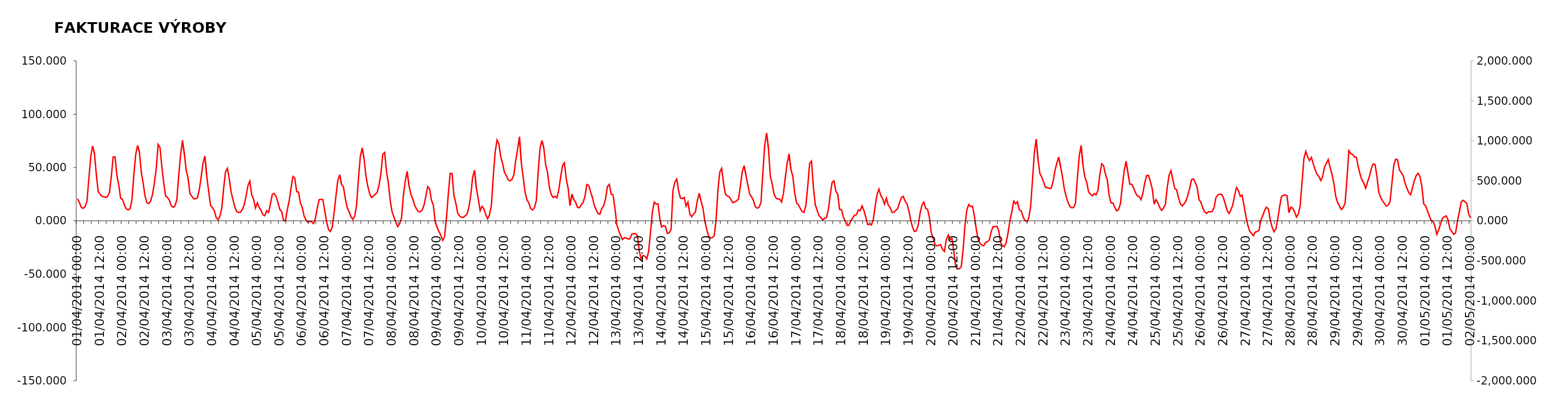
| Category | měření [MWh] |
|---|---|
| 01/04/2014 | 0 |
| 01/04/2014 | 0 |
| 01/04/2014 | 0 |
| 01/04/2014 | 0 |
| 01/04/2014 | 0 |
| 01/04/2014 | 0 |
| 01/04/2014 | 0 |
| 01/04/2014 | 0 |
| 01/04/2014 | 0 |
| 01/04/2014 | 0 |
| 01/04/2014 | 0 |
| 01/04/2014 | 0 |
| 01/04/2014 | 0 |
| 01/04/2014 | 0 |
| 01/04/2014 | 0 |
| 01/04/2014 | 0 |
| 01/04/2014 | 0 |
| 01/04/2014 | 0 |
| 01/04/2014 | 0 |
| 01/04/2014 | 0 |
| 01/04/2014 | 0 |
| 01/04/2014 | 0 |
| 01/04/2014 | 0 |
| 01/04/2014 | 0 |
| 02/04/2014 | 0 |
| 02/04/2014 | 0 |
| 02/04/2014 | 0 |
| 02/04/2014 | 0 |
| 02/04/2014 | 0 |
| 02/04/2014 | 0 |
| 02/04/2014 | 0 |
| 02/04/2014 | 0 |
| 02/04/2014 | 0 |
| 02/04/2014 | 0 |
| 02/04/2014 | 0 |
| 02/04/2014 | 0 |
| 02/04/2014 | 0 |
| 02/04/2014 | 0 |
| 02/04/2014 | 0 |
| 02/04/2014 | 0 |
| 02/04/2014 | 0 |
| 02/04/2014 | 0 |
| 02/04/2014 | 0 |
| 02/04/2014 | 0 |
| 02/04/2014 | 0 |
| 02/04/2014 | 0 |
| 02/04/2014 | 0 |
| 02/04/2014 | 0 |
| 03/04/2014 | 0 |
| 03/04/2014 | 0 |
| 03/04/2014 | 0 |
| 03/04/2014 | 0 |
| 03/04/2014 | 0 |
| 03/04/2014 | 0 |
| 03/04/2014 | 0 |
| 03/04/2014 | 0 |
| 03/04/2014 | 0 |
| 03/04/2014 | 0 |
| 03/04/2014 | 0 |
| 03/04/2014 | 0 |
| 03/04/2014 | 0 |
| 03/04/2014 | 0 |
| 03/04/2014 | 0 |
| 03/04/2014 | 0 |
| 03/04/2014 | 0 |
| 03/04/2014 | 0 |
| 03/04/2014 | 0 |
| 03/04/2014 | 0 |
| 03/04/2014 | 0 |
| 03/04/2014 | 0 |
| 03/04/2014 | 0 |
| 03/04/2014 | 0 |
| 04/04/2014 | 0 |
| 04/04/2014 | 0 |
| 04/04/2014 | 0 |
| 04/04/2014 | 0 |
| 04/04/2014 | 0 |
| 04/04/2014 | 0 |
| 04/04/2014 | 0 |
| 04/04/2014 | 0 |
| 04/04/2014 | 0 |
| 04/04/2014 | 0 |
| 04/04/2014 | 0 |
| 04/04/2014 | 0 |
| 04/04/2014 | 0 |
| 04/04/2014 | 0 |
| 04/04/2014 | 0 |
| 04/04/2014 | 0 |
| 04/04/2014 | 0 |
| 04/04/2014 | 0 |
| 04/04/2014 | 0 |
| 04/04/2014 | 0 |
| 04/04/2014 | 0 |
| 04/04/2014 | 0 |
| 04/04/2014 | 0 |
| 04/04/2014 | 0 |
| 05/04/2014 | 0 |
| 05/04/2014 | 0 |
| 05/04/2014 | 0 |
| 05/04/2014 | 0 |
| 05/04/2014 | 0 |
| 05/04/2014 | 0 |
| 05/04/2014 | 0 |
| 05/04/2014 | 0 |
| 05/04/2014 | 0 |
| 05/04/2014 | 0 |
| 05/04/2014 | 0 |
| 05/04/2014 | 0 |
| 05/04/2014 | 0 |
| 05/04/2014 | 0 |
| 05/04/2014 | 0 |
| 05/04/2014 | 0 |
| 05/04/2014 | 0 |
| 05/04/2014 | 0 |
| 05/04/2014 | 0 |
| 05/04/2014 | 0 |
| 05/04/2014 | 0 |
| 05/04/2014 | 0 |
| 05/04/2014 | 0 |
| 05/04/2014 | 0 |
| 06/04/2014 | 0 |
| 06/04/2014 | 0 |
| 06/04/2014 | 0 |
| 06/04/2014 | 0 |
| 06/04/2014 | 0 |
| 06/04/2014 | 0 |
| 06/04/2014 | 0 |
| 06/04/2014 | 0 |
| 06/04/2014 | 0 |
| 06/04/2014 | 0 |
| 06/04/2014 | 0 |
| 06/04/2014 | 0 |
| 06/04/2014 | 0 |
| 06/04/2014 | 0 |
| 06/04/2014 | 0 |
| 06/04/2014 | 0 |
| 06/04/2014 | 0 |
| 06/04/2014 | 0 |
| 06/04/2014 | 0 |
| 06/04/2014 | 0 |
| 06/04/2014 | 0 |
| 06/04/2014 | 0 |
| 06/04/2014 | 0 |
| 06/04/2014 | 0 |
| 07/04/2014 | 0 |
| 07/04/2014 | 0 |
| 07/04/2014 | 0 |
| 07/04/2014 | 0 |
| 07/04/2014 | 0 |
| 07/04/2014 | 0 |
| 07/04/2014 | 0 |
| 07/04/2014 | 0 |
| 07/04/2014 | 0 |
| 07/04/2014 | 0 |
| 07/04/2014 | 0 |
| 07/04/2014 | 0 |
| 07/04/2014 | 0 |
| 07/04/2014 | 0 |
| 07/04/2014 | 0 |
| 07/04/2014 | 0 |
| 07/04/2014 | 0 |
| 07/04/2014 | 0 |
| 07/04/2014 | 0 |
| 07/04/2014 | 0 |
| 07/04/2014 | 0 |
| 07/04/2014 | 0 |
| 07/04/2014 | 0 |
| 07/04/2014 | 0 |
| 08/04/2014 | 0 |
| 08/04/2014 | 0 |
| 08/04/2014 | 0 |
| 08/04/2014 | 0 |
| 08/04/2014 | 0 |
| 08/04/2014 | 0 |
| 08/04/2014 | 0 |
| 08/04/2014 | 0 |
| 08/04/2014 | 0 |
| 08/04/2014 | 0 |
| 08/04/2014 | 0 |
| 08/04/2014 | 0 |
| 08/04/2014 | 0 |
| 08/04/2014 | 0 |
| 08/04/2014 | 0 |
| 08/04/2014 | 0 |
| 08/04/2014 | 0 |
| 08/04/2014 | 0 |
| 08/04/2014 | 0 |
| 08/04/2014 | 0 |
| 08/04/2014 | 0 |
| 08/04/2014 | 0 |
| 08/04/2014 | 0 |
| 08/04/2014 | 0 |
| 09/04/2014 | 0 |
| 09/04/2014 | 0 |
| 09/04/2014 | 0 |
| 09/04/2014 | 0 |
| 09/04/2014 | 0 |
| 09/04/2014 | 0 |
| 09/04/2014 | 0 |
| 09/04/2014 | 0 |
| 09/04/2014 | 0 |
| 09/04/2014 | 0 |
| 09/04/2014 | 0 |
| 09/04/2014 | 0 |
| 09/04/2014 | 0 |
| 09/04/2014 | 0 |
| 09/04/2014 | 0 |
| 09/04/2014 | 0 |
| 09/04/2014 | 0 |
| 09/04/2014 | 0 |
| 09/04/2014 | 0 |
| 09/04/2014 | 0 |
| 09/04/2014 | 0 |
| 09/04/2014 | 0 |
| 09/04/2014 | 0 |
| 09/04/2014 | 0 |
| 10/04/2014 | 0 |
| 10/04/2014 | 0 |
| 10/04/2014 | 0 |
| 10/04/2014 | 0 |
| 10/04/2014 | 0 |
| 10/04/2014 | 0 |
| 10/04/2014 | 0 |
| 10/04/2014 | 0 |
| 10/04/2014 | 0 |
| 10/04/2014 | 0 |
| 10/04/2014 | 0 |
| 10/04/2014 | 0 |
| 10/04/2014 | 0 |
| 10/04/2014 | 0 |
| 10/04/2014 | 0 |
| 10/04/2014 | 0 |
| 10/04/2014 | 0 |
| 10/04/2014 | 0 |
| 10/04/2014 | 0 |
| 10/04/2014 | 0 |
| 10/04/2014 | 0 |
| 10/04/2014 | 0 |
| 10/04/2014 | 0 |
| 10/04/2014 | 0 |
| 11/04/2014 | 0 |
| 11/04/2014 | 0 |
| 11/04/2014 | 0 |
| 11/04/2014 | 0 |
| 11/04/2014 | 0 |
| 11/04/2014 | 0 |
| 11/04/2014 | 0 |
| 11/04/2014 | 0 |
| 11/04/2014 | 0 |
| 11/04/2014 | 0 |
| 11/04/2014 | 0 |
| 11/04/2014 | 0 |
| 11/04/2014 | 0 |
| 11/04/2014 | 0 |
| 11/04/2014 | 0 |
| 11/04/2014 | 0 |
| 11/04/2014 | 0 |
| 11/04/2014 | 0 |
| 11/04/2014 | 0 |
| 11/04/2014 | 0 |
| 11/04/2014 | 0 |
| 11/04/2014 | 0 |
| 11/04/2014 | 0 |
| 11/04/2014 | 0 |
| 12/04/2014 | 0 |
| 12/04/2014 | 0 |
| 12/04/2014 | 0 |
| 12/04/2014 | 0 |
| 12/04/2014 | 0 |
| 12/04/2014 | 0 |
| 12/04/2014 | 0 |
| 12/04/2014 | 0 |
| 12/04/2014 | 0 |
| 12/04/2014 | 0 |
| 12/04/2014 | 0 |
| 12/04/2014 | 0 |
| 12/04/2014 | 0 |
| 12/04/2014 | 0 |
| 12/04/2014 | 0 |
| 12/04/2014 | 0 |
| 12/04/2014 | 0 |
| 12/04/2014 | 0 |
| 12/04/2014 | 0 |
| 12/04/2014 | 0 |
| 12/04/2014 | 0 |
| 12/04/2014 | 0 |
| 12/04/2014 | 0 |
| 12/04/2014 | 0 |
| 13/04/2014 | 0 |
| 13/04/2014 | 0 |
| 13/04/2014 | 0 |
| 13/04/2014 | 0 |
| 13/04/2014 | 0 |
| 13/04/2014 | 0 |
| 13/04/2014 | 0 |
| 13/04/2014 | 0 |
| 13/04/2014 | 0 |
| 13/04/2014 | 0 |
| 13/04/2014 | 0 |
| 13/04/2014 | 0 |
| 13/04/2014 | 0 |
| 13/04/2014 | 0 |
| 13/04/2014 | 0 |
| 13/04/2014 | 0 |
| 13/04/2014 | 0 |
| 13/04/2014 | 0 |
| 13/04/2014 | 0 |
| 13/04/2014 | 0 |
| 13/04/2014 | 0 |
| 13/04/2014 | 0 |
| 13/04/2014 | 0 |
| 13/04/2014 | 0 |
| 14/04/2014 | 0 |
| 14/04/2014 | 0 |
| 14/04/2014 | 0 |
| 14/04/2014 | 0 |
| 14/04/2014 | 0 |
| 14/04/2014 | 0 |
| 14/04/2014 | 0 |
| 14/04/2014 | 0 |
| 14/04/2014 | 0 |
| 14/04/2014 | 0 |
| 14/04/2014 | 0 |
| 14/04/2014 | 0 |
| 14/04/2014 | 0 |
| 14/04/2014 | 0 |
| 14/04/2014 | 0 |
| 14/04/2014 | 0 |
| 14/04/2014 | 0 |
| 14/04/2014 | 0 |
| 14/04/2014 | 0 |
| 14/04/2014 | 0 |
| 14/04/2014 | 0 |
| 14/04/2014 | 0 |
| 14/04/2014 | 0 |
| 14/04/2014 | 0 |
| 15/04/2014 | 0 |
| 15/04/2014 | 0 |
| 15/04/2014 | 0 |
| 15/04/2014 | 0 |
| 15/04/2014 | 0 |
| 15/04/2014 | 0 |
| 15/04/2014 | 0 |
| 15/04/2014 | 0 |
| 15/04/2014 | 0 |
| 15/04/2014 | 0 |
| 15/04/2014 | 0 |
| 15/04/2014 | 0 |
| 15/04/2014 | 0 |
| 15/04/2014 | 0 |
| 15/04/2014 | 0 |
| 15/04/2014 | 0 |
| 15/04/2014 | 0 |
| 15/04/2014 | 0 |
| 15/04/2014 | 0 |
| 15/04/2014 | 0 |
| 15/04/2014 | 0 |
| 15/04/2014 | 0 |
| 15/04/2014 | 0 |
| 15/04/2014 | 0 |
| 16/04/2014 | 0 |
| 16/04/2014 | 0 |
| 16/04/2014 | 0 |
| 16/04/2014 | 0 |
| 16/04/2014 | 0 |
| 16/04/2014 | 0 |
| 16/04/2014 | 0 |
| 16/04/2014 | 0 |
| 16/04/2014 | 0 |
| 16/04/2014 | 0 |
| 16/04/2014 | 0 |
| 16/04/2014 | 0 |
| 16/04/2014 | 0 |
| 16/04/2014 | 0 |
| 16/04/2014 | 0 |
| 16/04/2014 | 0 |
| 16/04/2014 | 0 |
| 16/04/2014 | 0 |
| 16/04/2014 | 0 |
| 16/04/2014 | 0 |
| 16/04/2014 | 0 |
| 16/04/2014 | 0 |
| 16/04/2014 | 0 |
| 16/04/2014 | 0 |
| 17/04/2014 | 0 |
| 17/04/2014 | 0 |
| 17/04/2014 | 0 |
| 17/04/2014 | 0 |
| 17/04/2014 | 0 |
| 17/04/2014 | 0 |
| 17/04/2014 | 0 |
| 17/04/2014 | 0 |
| 17/04/2014 | 0 |
| 17/04/2014 | 0 |
| 17/04/2014 | 0 |
| 17/04/2014 | 0 |
| 17/04/2014 | 0 |
| 17/04/2014 | 0 |
| 17/04/2014 | 0 |
| 17/04/2014 | 0 |
| 17/04/2014 | 0 |
| 17/04/2014 | 0 |
| 17/04/2014 | 0 |
| 17/04/2014 | 0 |
| 17/04/2014 | 0 |
| 17/04/2014 | 0 |
| 17/04/2014 | 0 |
| 17/04/2014 | 0 |
| 18/04/2014 | 0 |
| 18/04/2014 | 0 |
| 18/04/2014 | 0 |
| 18/04/2014 | 0 |
| 18/04/2014 | 0 |
| 18/04/2014 | 0 |
| 18/04/2014 | 0 |
| 18/04/2014 | 0 |
| 18/04/2014 | 0 |
| 18/04/2014 | 0 |
| 18/04/2014 | 0 |
| 18/04/2014 | 0 |
| 18/04/2014 | 0 |
| 18/04/2014 | 0 |
| 18/04/2014 | 0 |
| 18/04/2014 | 0 |
| 18/04/2014 | 0 |
| 18/04/2014 | 0 |
| 18/04/2014 | 0 |
| 18/04/2014 | 0 |
| 18/04/2014 | 0 |
| 18/04/2014 | 0 |
| 18/04/2014 | 0 |
| 18/04/2014 | 0 |
| 19/04/2014 | 0 |
| 19/04/2014 | 0 |
| 19/04/2014 | 0 |
| 19/04/2014 | 0 |
| 19/04/2014 | 0 |
| 19/04/2014 | 0 |
| 19/04/2014 | 0 |
| 19/04/2014 | 0 |
| 19/04/2014 | 0 |
| 19/04/2014 | 0 |
| 19/04/2014 | 0 |
| 19/04/2014 | 0 |
| 19/04/2014 | 0 |
| 19/04/2014 | 0 |
| 19/04/2014 | 0 |
| 19/04/2014 | 0 |
| 19/04/2014 | 0 |
| 19/04/2014 | 0 |
| 19/04/2014 | 0 |
| 19/04/2014 | 0 |
| 19/04/2014 | 0 |
| 19/04/2014 | 0 |
| 19/04/2014 | 0 |
| 19/04/2014 | 0 |
| 20/04/2014 | 0 |
| 20/04/2014 | 0 |
| 20/04/2014 | 0 |
| 20/04/2014 | 0 |
| 20/04/2014 | 0 |
| 20/04/2014 | 0 |
| 20/04/2014 | 0 |
| 20/04/2014 | 0 |
| 20/04/2014 | 0 |
| 20/04/2014 | 0 |
| 20/04/2014 | 0 |
| 20/04/2014 | 0 |
| 20/04/2014 | 0 |
| 20/04/2014 | 0 |
| 20/04/2014 | 0 |
| 20/04/2014 | 0 |
| 20/04/2014 | 0 |
| 20/04/2014 | 0 |
| 20/04/2014 | 0 |
| 20/04/2014 | 0 |
| 20/04/2014 | 0 |
| 20/04/2014 | 0 |
| 20/04/2014 | 0 |
| 20/04/2014 | 0 |
| 21/04/2014 | 0 |
| 21/04/2014 | 0 |
| 21/04/2014 | 0 |
| 21/04/2014 | 0 |
| 21/04/2014 | 0 |
| 21/04/2014 | 0 |
| 21/04/2014 | 0 |
| 21/04/2014 | 0 |
| 21/04/2014 | 0 |
| 21/04/2014 | 0 |
| 21/04/2014 | 0 |
| 21/04/2014 | 0 |
| 21/04/2014 | 0 |
| 21/04/2014 | 0 |
| 21/04/2014 | 0 |
| 21/04/2014 | 0 |
| 21/04/2014 | 0 |
| 21/04/2014 | 0 |
| 21/04/2014 | 0 |
| 21/04/2014 | 0 |
| 21/04/2014 | 0 |
| 21/04/2014 | 0 |
| 21/04/2014 | 0 |
| 21/04/2014 | 0 |
| 22/04/2014 | 0 |
| 22/04/2014 | 0 |
| 22/04/2014 | 0 |
| 22/04/2014 | 0 |
| 22/04/2014 | 0 |
| 22/04/2014 | 0 |
| 22/04/2014 | 0 |
| 22/04/2014 | 0 |
| 22/04/2014 | 0 |
| 22/04/2014 | 0 |
| 22/04/2014 | 0 |
| 22/04/2014 | 0 |
| 22/04/2014 | 0 |
| 22/04/2014 | 0 |
| 22/04/2014 | 0 |
| 22/04/2014 | 0 |
| 22/04/2014 | 0 |
| 22/04/2014 | 0 |
| 22/04/2014 | 0 |
| 22/04/2014 | 0 |
| 22/04/2014 | 0 |
| 22/04/2014 | 0 |
| 22/04/2014 | 0 |
| 22/04/2014 | 0 |
| 23/04/2014 | 0 |
| 23/04/2014 | 0 |
| 23/04/2014 | 0 |
| 23/04/2014 | 0 |
| 23/04/2014 | 0 |
| 23/04/2014 | 0 |
| 23/04/2014 | 0 |
| 23/04/2014 | 0 |
| 23/04/2014 | 0 |
| 23/04/2014 | 0 |
| 23/04/2014 | 0 |
| 23/04/2014 | 0 |
| 23/04/2014 | 0 |
| 23/04/2014 | 0 |
| 23/04/2014 | 0 |
| 23/04/2014 | 0 |
| 23/04/2014 | 0 |
| 23/04/2014 | 0 |
| 23/04/2014 | 0 |
| 23/04/2014 | 0 |
| 23/04/2014 | 0 |
| 23/04/2014 | 0 |
| 23/04/2014 | 0 |
| 23/04/2014 | 0 |
| 24/04/2014 | 0 |
| 24/04/2014 | 0 |
| 24/04/2014 | 0 |
| 24/04/2014 | 0 |
| 24/04/2014 | 0 |
| 24/04/2014 | 0 |
| 24/04/2014 | 0 |
| 24/04/2014 | 0 |
| 24/04/2014 | 0 |
| 24/04/2014 | 0 |
| 24/04/2014 | 0 |
| 24/04/2014 | 0 |
| 24/04/2014 | 0 |
| 24/04/2014 | 0 |
| 24/04/2014 | 0 |
| 24/04/2014 | 0 |
| 24/04/2014 | 0 |
| 24/04/2014 | 0 |
| 24/04/2014 | 0 |
| 24/04/2014 | 0 |
| 24/04/2014 | 0 |
| 24/04/2014 | 0 |
| 24/04/2014 | 0 |
| 24/04/2014 | 0 |
| 25/04/2014 | 0 |
| 25/04/2014 | 0 |
| 25/04/2014 | 0 |
| 25/04/2014 | 0 |
| 25/04/2014 | 0 |
| 25/04/2014 | 0 |
| 25/04/2014 | 0 |
| 25/04/2014 | 0 |
| 25/04/2014 | 0 |
| 25/04/2014 | 0 |
| 25/04/2014 | 0 |
| 25/04/2014 | 0 |
| 25/04/2014 | 0 |
| 25/04/2014 | 0 |
| 25/04/2014 | 0 |
| 25/04/2014 | 0 |
| 25/04/2014 | 0 |
| 25/04/2014 | 0 |
| 25/04/2014 | 0 |
| 25/04/2014 | 0 |
| 25/04/2014 | 0 |
| 25/04/2014 | 0 |
| 25/04/2014 | 0 |
| 25/04/2014 | 0 |
| 26/04/2014 | 0 |
| 26/04/2014 | 0 |
| 26/04/2014 | 0 |
| 26/04/2014 | 0 |
| 26/04/2014 | 0 |
| 26/04/2014 | 0 |
| 26/04/2014 | 0 |
| 26/04/2014 | 0 |
| 26/04/2014 | 0 |
| 26/04/2014 | 0 |
| 26/04/2014 | 0 |
| 26/04/2014 | 0 |
| 26/04/2014 | 0 |
| 26/04/2014 | 0 |
| 26/04/2014 | 0 |
| 26/04/2014 | 0 |
| 26/04/2014 | 0 |
| 26/04/2014 | 0 |
| 26/04/2014 | 0 |
| 26/04/2014 | 0 |
| 26/04/2014 | 0 |
| 26/04/2014 | 0 |
| 26/04/2014 | 0 |
| 26/04/2014 | 0 |
| 27/04/2014 | 0 |
| 27/04/2014 | 0 |
| 27/04/2014 | 0 |
| 27/04/2014 | 0 |
| 27/04/2014 | 0 |
| 27/04/2014 | 0 |
| 27/04/2014 | 0 |
| 27/04/2014 | 0 |
| 27/04/2014 | 0 |
| 27/04/2014 | 0 |
| 27/04/2014 | 0 |
| 27/04/2014 | 0 |
| 27/04/2014 | 0 |
| 27/04/2014 | 0 |
| 27/04/2014 | 0 |
| 27/04/2014 | 0 |
| 27/04/2014 | 0 |
| 27/04/2014 | 0 |
| 27/04/2014 | 0 |
| 27/04/2014 | 0 |
| 27/04/2014 | 0 |
| 27/04/2014 | 0 |
| 27/04/2014 | 0 |
| 27/04/2014 | 0 |
| 28/04/2014 | 0 |
| 28/04/2014 | 0 |
| 28/04/2014 | 0 |
| 28/04/2014 | 0 |
| 28/04/2014 | 0 |
| 28/04/2014 | 0 |
| 28/04/2014 | 0 |
| 28/04/2014 | 0 |
| 28/04/2014 | 0 |
| 28/04/2014 | 0 |
| 28/04/2014 | 0 |
| 28/04/2014 | 0 |
| 28/04/2014 | 0 |
| 28/04/2014 | 0 |
| 28/04/2014 | 0 |
| 28/04/2014 | 0 |
| 28/04/2014 | 0 |
| 28/04/2014 | 0 |
| 28/04/2014 | 0 |
| 28/04/2014 | 0 |
| 28/04/2014 | 0 |
| 28/04/2014 | 0 |
| 28/04/2014 | 0 |
| 28/04/2014 | 0 |
| 29/04/2014 | 0 |
| 29/04/2014 | 0 |
| 29/04/2014 | 0 |
| 29/04/2014 | 0 |
| 29/04/2014 | 0 |
| 29/04/2014 | 0 |
| 29/04/2014 | 0 |
| 29/04/2014 | 0 |
| 29/04/2014 | 0 |
| 29/04/2014 | 0 |
| 29/04/2014 | 0 |
| 29/04/2014 | 0 |
| 29/04/2014 | 0 |
| 29/04/2014 | 0 |
| 29/04/2014 | 0 |
| 29/04/2014 | 0 |
| 29/04/2014 | 0 |
| 29/04/2014 | 0 |
| 29/04/2014 | 0 |
| 29/04/2014 | 0 |
| 29/04/2014 | 0 |
| 29/04/2014 | 0 |
| 29/04/2014 | 0 |
| 29/04/2014 | 0 |
| 30/04/2014 | 0 |
| 30/04/2014 | 0 |
| 30/04/2014 | 0 |
| 30/04/2014 | 0 |
| 30/04/2014 | 0 |
| 30/04/2014 | 0 |
| 30/04/2014 | 0 |
| 30/04/2014 | 0 |
| 30/04/2014 | 0 |
| 30/04/2014 | 0 |
| 30/04/2014 | 0 |
| 30/04/2014 | 0 |
| 30/04/2014 | 0 |
| 30/04/2014 | 0 |
| 30/04/2014 | 0 |
| 30/04/2014 | 0 |
| 30/04/2014 | 0 |
| 30/04/2014 | 0 |
| 30/04/2014 | 0 |
| 30/04/2014 | 0 |
| 30/04/2014 | 0 |
| 30/04/2014 | 0 |
| 30/04/2014 | 0 |
| 30/04/2014 | 0 |
| 01/05/2014 | 0 |
| 01/05/2014 | 0 |
| 01/05/2014 | 0 |
| 01/05/2014 | 0 |
| 01/05/2014 | 0 |
| 01/05/2014 | 0 |
| 01/05/2014 | 0 |
| 01/05/2014 | 0 |
| 01/05/2014 | 0 |
| 01/05/2014 | 0 |
| 01/05/2014 | 0 |
| 01/05/2014 | 0 |
| 01/05/2014 | 0 |
| 01/05/2014 | 0 |
| 01/05/2014 | 0 |
| 01/05/2014 | 0 |
| 01/05/2014 | 0 |
| 01/05/2014 | 0 |
| 01/05/2014 | 0 |
| 01/05/2014 | 0 |
| 01/05/2014 | 0 |
| 01/05/2014 | 0 |
| 01/05/2014 | 0 |
| 01/05/2014 | 0 |
| 02/05/2014 | 0 |